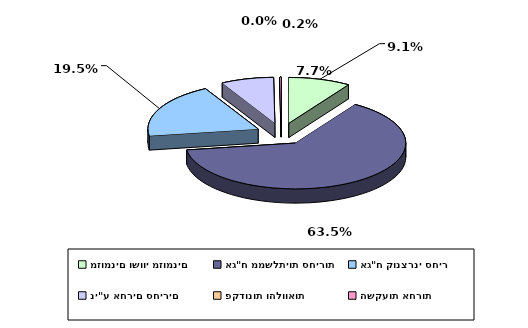
| Category | Series 0 |
|---|---|
| מזומנים ושווי מזומנים | 0.091 |
| אג"ח ממשלתיות סחירות | 0.635 |
| אג"ח קונצרני סחיר | 0.195 |
| ני"ע אחרים סחירים | 0.077 |
| פקדונות והלוואות | 0 |
| השקעות אחרות | 0.002 |